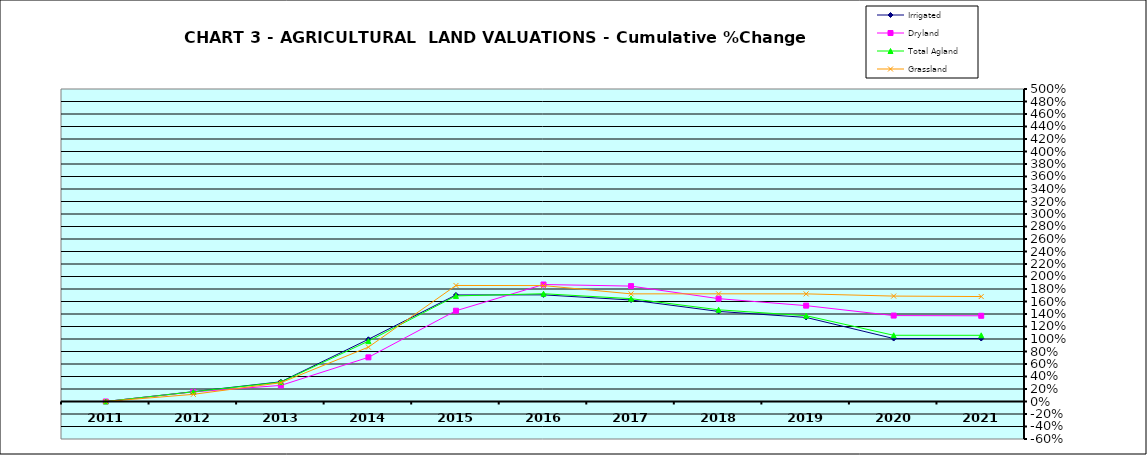
| Category | Irrigated | Dryland | Total Agland | Grassland |
|---|---|---|---|---|
| 2011.0 | 0 | 0 | 0 | 0 |
| 2012.0 | 0.157 | 0.153 | 0.156 | 0.115 |
| 2013.0 | 0.315 | 0.257 | 0.31 | 0.3 |
| 2014.0 | 0.995 | 0.707 | 0.966 | 0.87 |
| 2015.0 | 1.705 | 1.452 | 1.69 | 1.857 |
| 2016.0 | 1.706 | 1.872 | 1.724 | 1.855 |
| 2017.0 | 1.624 | 1.846 | 1.646 | 1.722 |
| 2018.0 | 1.441 | 1.646 | 1.467 | 1.723 |
| 2019.0 | 1.345 | 1.534 | 1.373 | 1.722 |
| 2020.0 | 1.007 | 1.375 | 1.06 | 1.687 |
| 2021.0 | 1.008 | 1.371 | 1.059 | 1.679 |